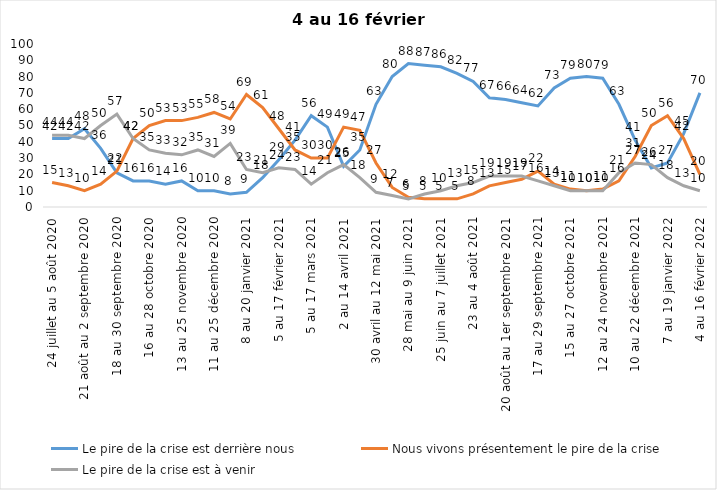
| Category | Le pire de la crise est derrière nous | Nous vivons présentement le pire de la crise | Le pire de la crise est à venir |
|---|---|---|---|
| 24 juillet au 5 août 2020 | 42 | 15 | 44 |
| 7 au 19 août 2020 | 42 | 13 | 44 |
| 21 août au 2 septembre 2020 | 48 | 10 | 42 |
| 4 au 16 septembre 2020 | 36 | 14 | 50 |
| 18 au 30 septembre 2020 | 21 | 22 | 57 |
| 2 au 14 octobre 2020 | 16 | 42 | 42 |
| 16 au 28 octobre 2020 | 16 | 50 | 35 |
| 30 octobre au 11 novembre 2020 | 14 | 53 | 33 |
| 13 au 25 novembre 2020 | 16 | 53 | 32 |
| 27 au 9 décembre 2020 | 10 | 55 | 35 |
| 11 au 25 décembre 2020 | 10 | 58 | 31 |
| 25 décembre 2020 au 6 janvier 2021 | 8 | 54 | 39 |
| 8 au 20 janvier 2021 | 9 | 69 | 23 |
| 22 janvier au 3 février 2021 | 18 | 61 | 21 |
| 5 au 17 février 2021 | 29 | 48 | 24 |
| 19 février au 3 mars 2021 | 41 | 35 | 23 |
| 5 au 17 mars 2021 | 56 | 30 | 14 |
| 19 au 31 mars 2021 | 49 | 30 | 21 |
| 2 au 14 avril 2021 | 25 | 49 | 26 |
| 16 au 28 avril 2021 | 35 | 47 | 18 |
| 30 avril au 12 mai 2021 | 63 | 27 | 9 |
| 14 au 26 mai 2021 | 80 | 12 | 7 |
| 28 mai au 9 juin 2021 | 88 | 6 | 5 |
| 11 au 23 juin 2021 | 87 | 5 | 8 |
| 25 juin au 7 juillet 2021 | 86 | 5 | 10 |
| 9 au 21 juillet 2021 | 82 | 5 | 13 |
| 23 au 4 août 2021 | 77 | 8 | 15 |
| 6 au 18 août 2021 | 67 | 13 | 19 |
| 20 août au 1er septembre 2021 | 66 | 15 | 19 |
| 3 au 15 septembre 2021 | 64 | 17 | 19 |
| 17 au 29 septembre 2021 | 62 | 22 | 16 |
| 1 au 13 octobre 2021 | 73 | 14 | 13 |
| 15 au 27 octobre 2021 | 79 | 11 | 10 |
| 29 octobre au 10 novembre 2021 | 80 | 10 | 10 |
| 12 au 24 novembre 2021 | 79 | 11 | 10 |
| 26 novembre au 8 décembre 2021 | 63 | 16 | 21 |
| 10 au 22 décembre 2021 | 41 | 31 | 27 |
| 24 décembre 2021 au 5 janvier 2022 2022 | 24 | 50 | 26 |
| 7 au 19 janvier 2022 | 27 | 56 | 18 |
| 21 janvier au 2 février 2022 | 45 | 42 | 13 |
| 4 au 16 février 2022 | 70 | 20 | 10 |